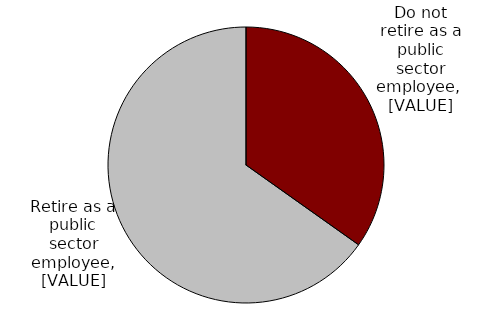
| Category | Series 2 |
|---|---|
| 0 | 0.348 |
| 1 | 0.652 |